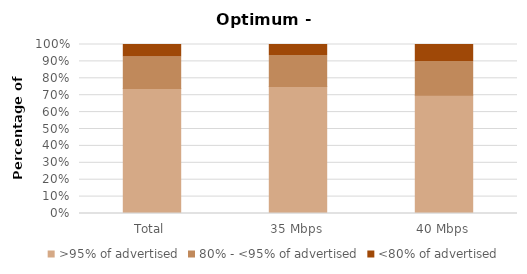
| Category | >95% of advertised | 80% - <95% of advertised | <80% of advertised |
|---|---|---|---|
| Total | 0.74 | 0.186 | 0.073 |
| 35 Mbps | 0.752 | 0.182 | 0.066 |
| 40 Mbps | 0.7 | 0.2 | 0.1 |